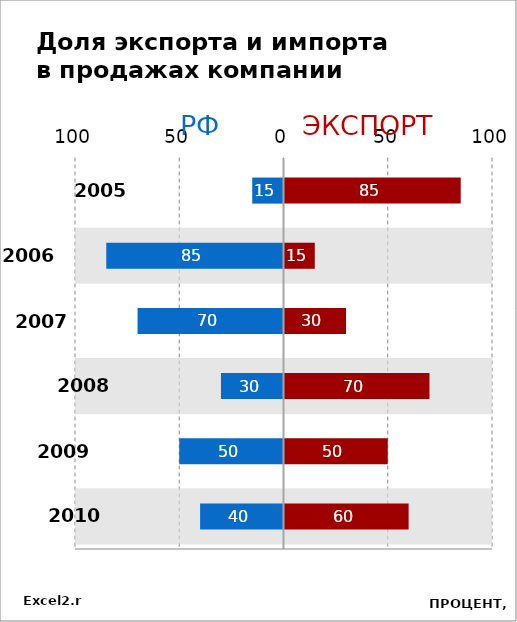
| Category | Служ1 |
|---|---|
| 2005.0 | 100 |
| 2006.0 | 100 |
| 2007.0 | 100 |
| 2008.0 | 100 |
| 2009.0 | 100 |
| 2010.0 | 100 |